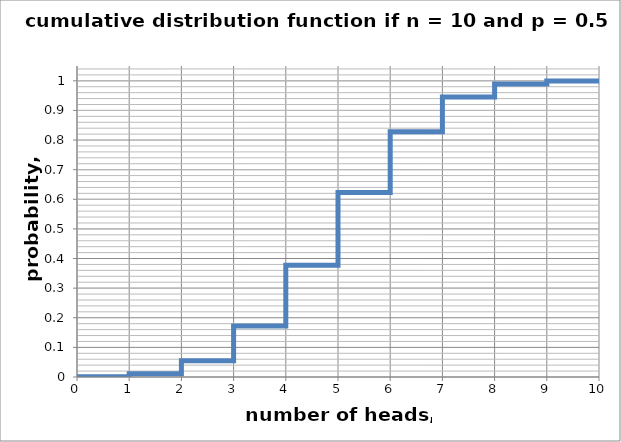
| Category | p |
|---|---|
| 0.0 | 0.001 |
| 1.0 | 0.001 |
| 1.0 | 0.011 |
| 2.0 | 0.011 |
| 2.0 | 0.055 |
| 3.0 | 0.055 |
| 3.0 | 0.172 |
| 4.0 | 0.172 |
| 4.0 | 0.377 |
| 5.0 | 0.377 |
| 5.0 | 0.623 |
| 6.0 | 0.623 |
| 6.0 | 0.828 |
| 7.0 | 0.828 |
| 7.0 | 0.945 |
| 8.0 | 0.945 |
| 8.0 | 0.989 |
| 9.0 | 0.989 |
| 9.0 | 0.999 |
| 10.0 | 0.999 |
| 10.0 | 1 |